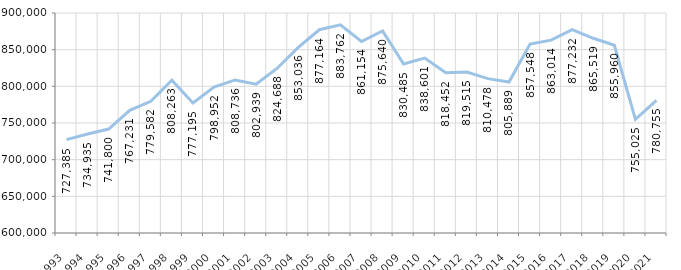
| Category | Series 0 |
|---|---|
| 1993 | 727385.385 |
| 1994 | 734935.21 |
| 1995 | 741799.62 |
| 1996 | 767230.94 |
| 1997 | 779582.323 |
| 1998 | 808262.619 |
| 1999 | 777195.009 |
| 2000 | 798951.616 |
| 2001 | 808736.438 |
| 2002 | 802938.588 |
| 2003 | 824688.426 |
| 2004 | 853035.881 |
| 2005 | 877164.003 |
| 2006 | 883762.28 |
| 2007 | 861154.248 |
| 2008 | 875639.965 |
| 2009 | 830485.168 |
| 2010 | 838600.691 |
| 2011 | 818451.698 |
| 2012 | 819515.113 |
| 2013 | 810477.578 |
| 2014 | 805889.047 |
| 2015 | 857548.111 |
| 2016 | 863014.141 |
| 2017 | 877232.114 |
| 2018 | 865519.326 |
| 2019 | 855959.946 |
| 2020 | 755025.304 |
| 2021 | 780754.6 |